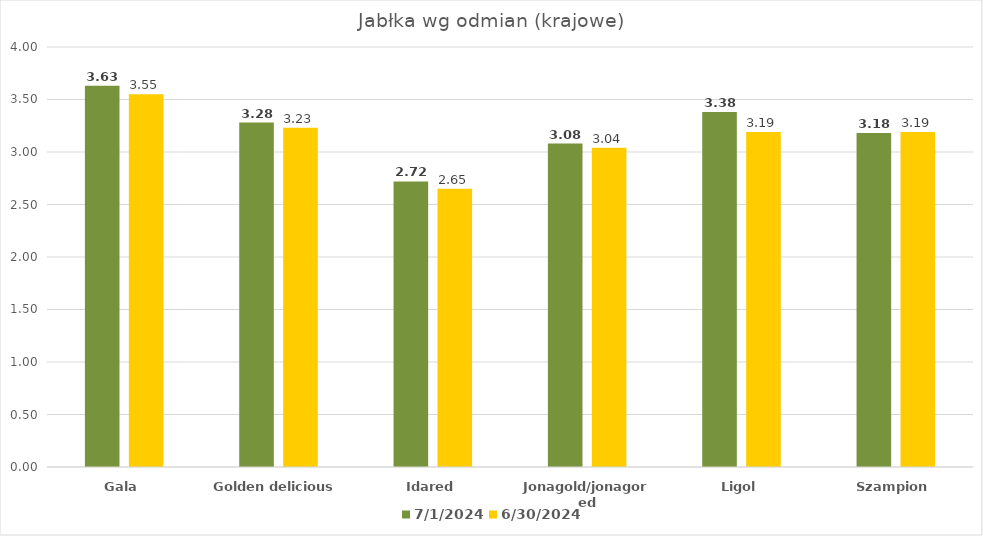
| Category | 2024-07-01 | 2024-06-30 |
|---|---|---|
| Gala | 3.63 | 3.55 |
| Golden delicious | 3.28 | 3.23 |
| Idared | 2.72 | 2.65 |
| Jonagold/jonagored | 3.08 | 3.04 |
| Ligol | 3.38 | 3.19 |
| Szampion | 3.18 | 3.19 |